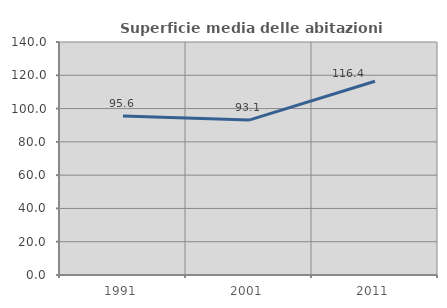
| Category | Superficie media delle abitazioni occupate |
|---|---|
| 1991.0 | 95.561 |
| 2001.0 | 93.067 |
| 2011.0 | 116.448 |